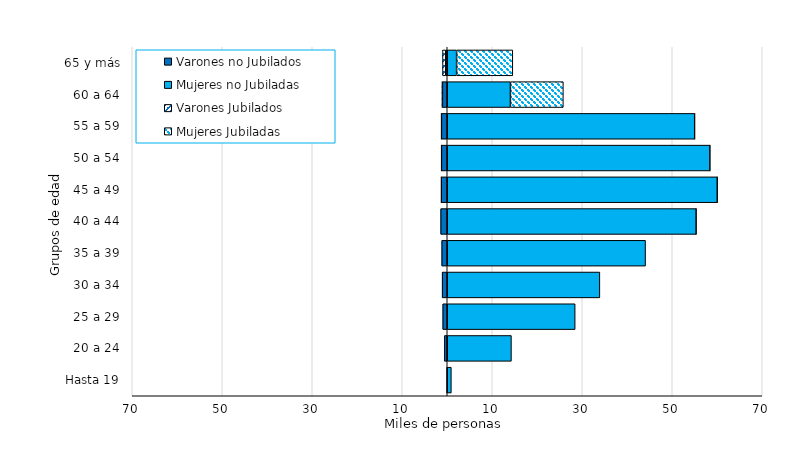
| Category | Varones no Jubilados | Mujeres no Jubiladas | Varones Jubilados | Mujeres Jubiladas |
|---|---|---|---|---|
| Hasta 19 | -106 | 912 | 0 | 0 |
| 20 a 24 | -641 | 14262 | 0 | 0 |
| 25 a 29 | -1002 | 28427 | 0 | 0 |
| 30 a 34 | -1129 | 33914 | 0 | 0 |
| 35 a 39 | -1230 | 44070 | 0 | 0 |
| 40 a 44 | -1463 | 55335 | 0 | 1 |
| 45 a 49 | -1330 | 60024 | -1 | 2 |
| 50 a 54 | -1295 | 58389 | -3 | 13 |
| 55 a 59 | -1302 | 54997 | -14 | 20 |
| 60 a 64 | -1081 | 14042 | -90 | 11759 |
| 65 y más | -329 | 2085 | -720 | 12482 |